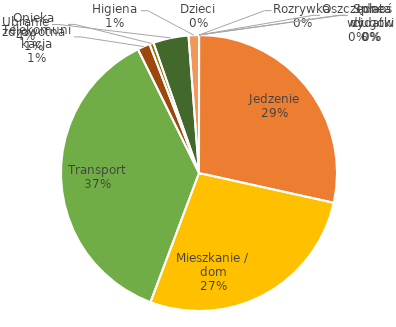
| Category | Series 0 | Series 1 |
|---|---|---|
| Jedzenie | 585 |  |
| Mieszkanie / dom | 560 |  |
| Transport | 760 |  |
| Telekomunikacja | 30 |  |
| Opieka zdrowotna | 10 |  |
| Ubranie | 85 |  |
| Higiena | 25 |  |
| Dzieci | 0 |  |
| Rozrywka | 0 |  |
| Inne wydatki | 0 |  |
| Spłata długów | 0 |  |
| Oszczędności | 0 |  |